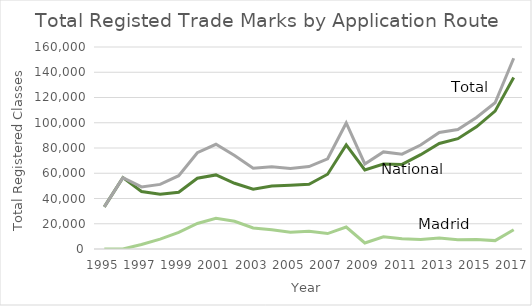
| Category | National | Madrid2 | Total |
|---|---|---|---|
| 1995.0 | 33400 | 0 | 33400 |
| 1996.0 | 56531 | 0 | 56531 |
| 1997.0 | 45567 | 3620 | 49187 |
| 1998.0 | 43370 | 7799 | 51169 |
| 1999.0 | 44932 | 13145 | 58077 |
| 2000.0 | 56061 | 20229 | 76290 |
| 2001.0 | 58684 | 24251 | 82935 |
| 2002.0 | 52081 | 21990 | 74071 |
| 2003.0 | 47332 | 16656 | 63988 |
| 2004.0 | 49913 | 15262 | 65175 |
| 2005.0 | 50555 | 13205 | 63760 |
| 2006.0 | 51276 | 14051 | 65327 |
| 2007.0 | 59217 | 12237 | 71454 |
| 2008.0 | 82409 | 17425 | 99834 |
| 2009.0 | 62568 | 4770 | 67338 |
| 2010.0 | 67244 | 9674 | 76918 |
| 2011.0 | 67027 | 8081 | 75108 |
| 2012.0 | 74707 | 7615 | 82322 |
| 2013.0 | 83624 | 8630 | 92254 |
| 2014.0 | 87372 | 7316 | 94688 |
| 2015.0 | 96726 | 7493 | 104219 |
| 2016.0 | 109219 | 6646 | 115865 |
| 2017.0 | 135822 | 15270 | 151092 |